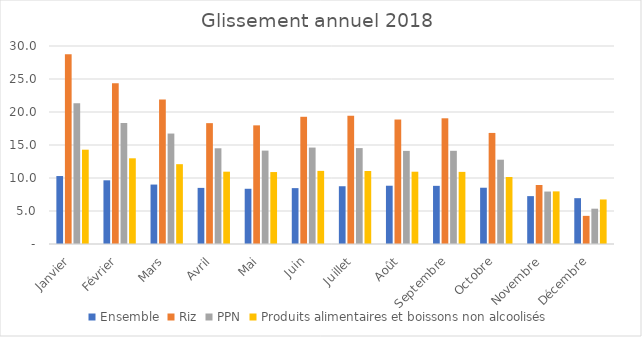
| Category |  Ensemble  |  Riz  |  PPN  |  Produits alimentaires et boissons non alcoolisés  |
|---|---|---|---|---|
| Janvier | 10.297 | 28.74 | 21.321 | 14.29 |
| Février | 9.651 | 24.34 | 18.331 | 12.985 |
| Mars | 9.006 | 21.876 | 16.736 | 12.094 |
| Avril | 8.502 | 18.311 | 14.502 | 10.958 |
| Mai | 8.368 | 17.977 | 14.15 | 10.901 |
| Juin | 8.467 | 19.275 | 14.611 | 11.08 |
| Juillet | 8.752 | 19.445 | 14.532 | 11.057 |
| Août | 8.829 | 18.861 | 14.109 | 10.953 |
| Septembre | 8.812 | 19.046 | 14.122 | 10.928 |
| Octobre | 8.526 | 16.829 | 12.772 | 10.152 |
| Novembre | 7.254 | 8.943 | 7.947 | 7.972 |
| Décembre | 6.943 | 4.263 | 5.35 | 6.747 |